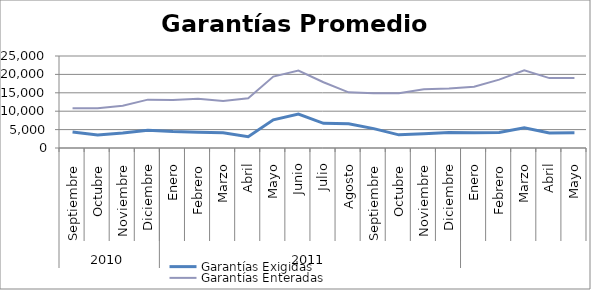
| Category | Garantías Exigidas | Garantías Enteradas |
|---|---|---|
| 0 | 4372.607 | 10829.062 |
| 1 | 3557.93 | 10787.9 |
| 2 | 4056.528 | 11463.422 |
| 3 | 4832.111 | 13142.881 |
| 4 | 4466.32 | 13061.162 |
| 5 | 4313.718 | 13357.444 |
| 6 | 4162.491 | 12796.251 |
| 7 | 3090.395 | 13495.263 |
| 8 | 7655.186 | 19416.342 |
| 9 | 9198.096 | 21035.301 |
| 10 | 6699.851 | 17866.843 |
| 11 | 6615.292 | 15119.839 |
| 12 | 5266.973 | 14911.639 |
| 13 | 3572.137 | 14861.465 |
| 14 | 3876.388 | 15976.819 |
| 15 | 4182.413 | 16147.351 |
| 16 | 4146.8 | 16662.483 |
| 17 | 4190.531 | 18572.749 |
| 18 | 5482.211 | 21128.648 |
| 19 | 4079.038 | 18997.51 |
| 20 | 4141.554 | 19005.364 |